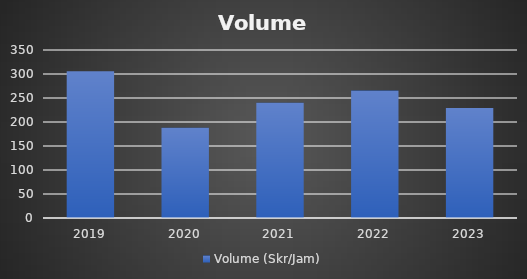
| Category | Volume (Skr/Jam) |
|---|---|
| 2019.0 | 305.547 |
| 2020.0 | 188.263 |
| 2021.0 | 240.215 |
| 2022.0 | 265.42 |
| 2023.0 | 229.146 |